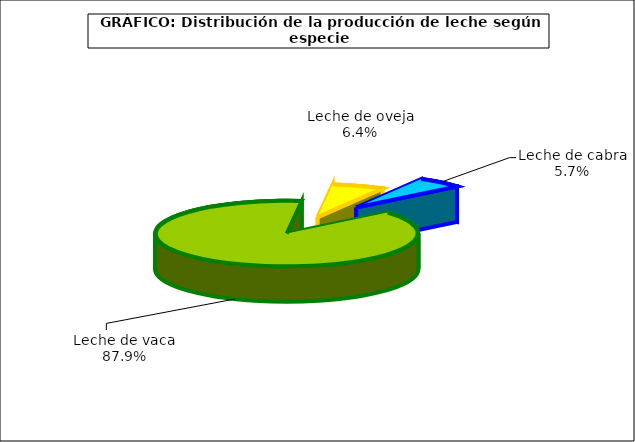
| Category | Series 0 |
|---|---|
| Leche de vaca | 7237.836 |
| Leche de oveja | 525.963 |
| Leche de cabra | 467.584 |